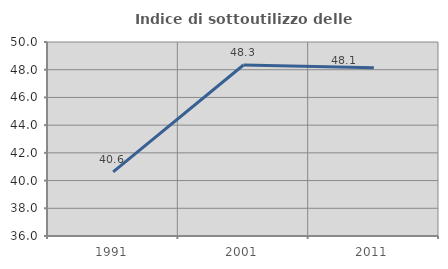
| Category | Indice di sottoutilizzo delle abitazioni  |
|---|---|
| 1991.0 | 40.63 |
| 2001.0 | 48.342 |
| 2011.0 | 48.144 |